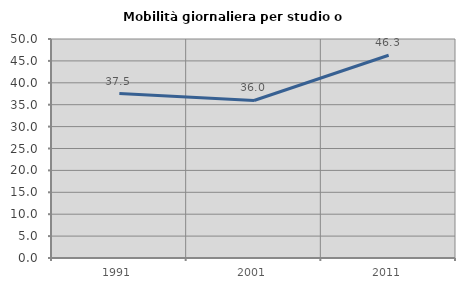
| Category | Mobilità giornaliera per studio o lavoro |
|---|---|
| 1991.0 | 37.544 |
| 2001.0 | 35.965 |
| 2011.0 | 46.299 |